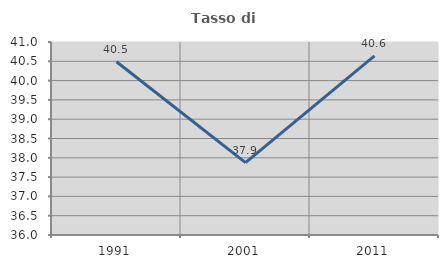
| Category | Tasso di occupazione   |
|---|---|
| 1991.0 | 40.489 |
| 2001.0 | 37.875 |
| 2011.0 | 40.639 |